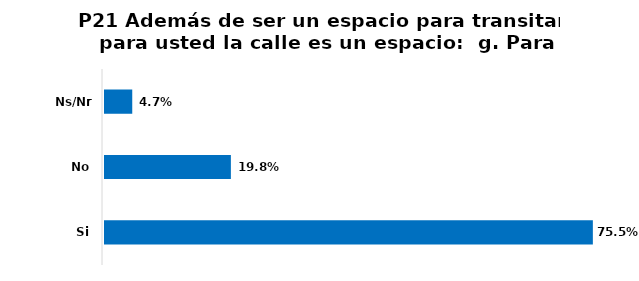
| Category | Series 0 |
|---|---|
| Si | 0.755 |
| No | 0.198 |
| Ns/Nr | 0.047 |